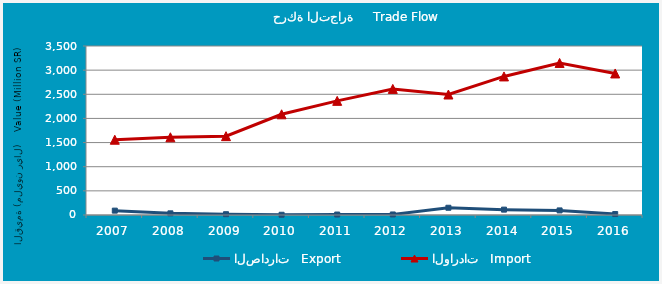
| Category | الصادرات   Export | الواردات   Import |
|---|---|---|
| 2007.0 | 90.296 | 1558.942 |
| 2008.0 | 34.316 | 1609.385 |
| 2009.0 | 16.562 | 1632.976 |
| 2010.0 | 5.061 | 2085.454 |
| 2011.0 | 9.675 | 2363.724 |
| 2012.0 | 11.138 | 2611.178 |
| 2013.0 | 150.026 | 2495.529 |
| 2014.0 | 111.201 | 2869.78 |
| 2015.0 | 94.997 | 3149.11 |
| 2016.0 | 19.439 | 2931.268 |